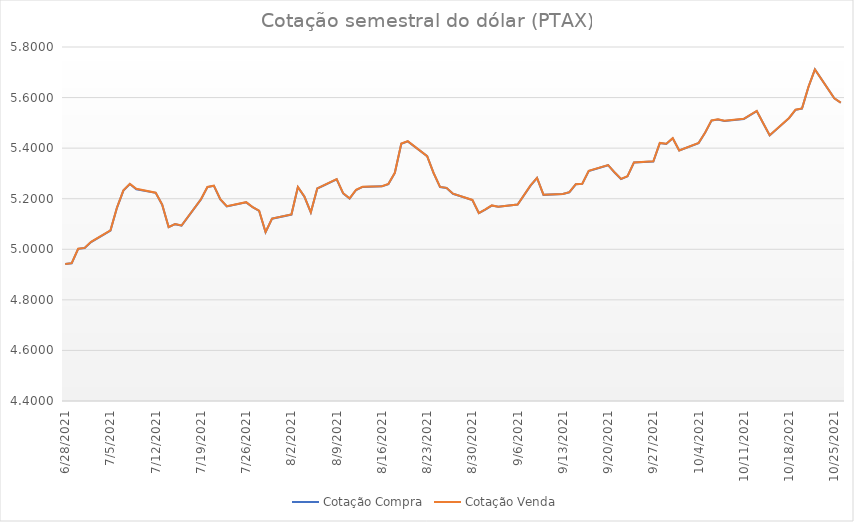
| Category | Cotação Compra | Cotação Venda |
|---|---|---|
| 10/26/21 | 5.579 | 5.58 |
| 10/25/21 | 5.597 | 5.597 |
| 10/22/21 | 5.711 | 5.712 |
| 10/21/21 | 5.642 | 5.642 |
| 10/20/21 | 5.556 | 5.557 |
| 10/19/21 | 5.552 | 5.552 |
| 10/18/21 | 5.519 | 5.519 |
| 10/15/21 | 5.45 | 5.451 |
| 10/14/21 | 5.498 | 5.499 |
| 10/13/21 | 5.546 | 5.547 |
| 10/11/21 | 5.516 | 5.516 |
| 10/8/21 | 5.508 | 5.508 |
| 10/7/21 | 5.513 | 5.514 |
| 10/6/21 | 5.509 | 5.51 |
| 10/5/21 | 5.46 | 5.461 |
| 10/4/21 | 5.42 | 5.42 |
| 10/1/21 | 5.39 | 5.391 |
| 9/30/21 | 5.439 | 5.439 |
| 9/29/21 | 5.417 | 5.417 |
| 9/28/21 | 5.42 | 5.421 |
| 9/27/21 | 5.347 | 5.348 |
| 9/24/21 | 5.343 | 5.344 |
| 9/23/21 | 5.288 | 5.289 |
| 9/22/21 | 5.278 | 5.278 |
| 9/21/21 | 5.304 | 5.304 |
| 9/20/21 | 5.333 | 5.333 |
| 9/17/21 | 5.31 | 5.31 |
| 9/16/21 | 5.259 | 5.259 |
| 9/15/21 | 5.257 | 5.258 |
| 9/14/21 | 5.225 | 5.226 |
| 9/13/21 | 5.218 | 5.219 |
| 9/10/21 | 5.215 | 5.216 |
| 9/9/21 | 5.282 | 5.282 |
| 9/8/21 | 5.252 | 5.252 |
| 9/6/21 | 5.177 | 5.177 |
| 9/3/21 | 5.168 | 5.168 |
| 9/2/21 | 5.173 | 5.174 |
| 9/1/21 | 5.157 | 5.158 |
| 8/31/21 | 5.143 | 5.143 |
| 8/30/21 | 5.195 | 5.195 |
| 8/27/21 | 5.219 | 5.22 |
| 8/26/21 | 5.242 | 5.243 |
| 8/25/21 | 5.246 | 5.246 |
| 8/24/21 | 5.301 | 5.302 |
| 8/23/21 | 5.368 | 5.369 |
| 8/20/21 | 5.427 | 5.427 |
| 8/19/21 | 5.417 | 5.418 |
| 8/18/21 | 5.302 | 5.302 |
| 8/17/21 | 5.258 | 5.258 |
| 8/16/21 | 5.249 | 5.25 |
| 8/13/21 | 5.247 | 5.247 |
| 8/12/21 | 5.234 | 5.235 |
| 8/11/21 | 5.201 | 5.201 |
| 8/10/21 | 5.221 | 5.222 |
| 8/9/21 | 5.277 | 5.277 |
| 8/6/21 | 5.24 | 5.241 |
| 8/5/21 | 5.146 | 5.146 |
| 8/4/21 | 5.208 | 5.209 |
| 8/3/21 | 5.246 | 5.246 |
| 8/2/21 | 5.137 | 5.138 |
| 7/30/21 | 5.121 | 5.122 |
| 7/29/21 | 5.068 | 5.068 |
| 7/28/21 | 5.152 | 5.153 |
| 7/27/21 | 5.166 | 5.167 |
| 7/26/21 | 5.186 | 5.186 |
| 7/23/21 | 5.17 | 5.17 |
| 7/22/21 | 5.197 | 5.198 |
| 7/21/21 | 5.251 | 5.252 |
| 7/20/21 | 5.246 | 5.246 |
| 7/19/21 | 5.197 | 5.198 |
| 7/16/21 | 5.094 | 5.094 |
| 7/15/21 | 5.099 | 5.1 |
| 7/14/21 | 5.087 | 5.088 |
| 7/13/21 | 5.176 | 5.177 |
| 7/12/21 | 5.223 | 5.224 |
| 7/9/21 | 5.237 | 5.239 |
| 7/8/21 | 5.258 | 5.259 |
| 7/7/21 | 5.232 | 5.233 |
| 7/6/21 | 5.164 | 5.164 |
| 7/5/21 | 5.074 | 5.075 |
| 7/2/21 | 5.029 | 5.029 |
| 7/1/21 | 5.005 | 5.006 |
| 6/30/21 | 5.002 | 5.002 |
| 6/29/21 | 4.944 | 4.945 |
| 6/28/21 | 4.941 | 4.942 |